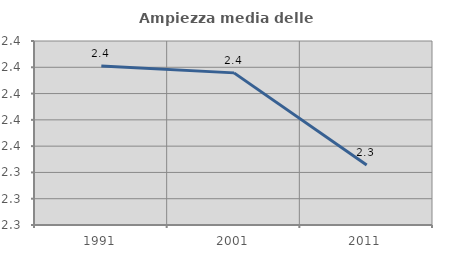
| Category | Ampiezza media delle famiglie |
|---|---|
| 1991.0 | 2.421 |
| 2001.0 | 2.416 |
| 2011.0 | 2.346 |